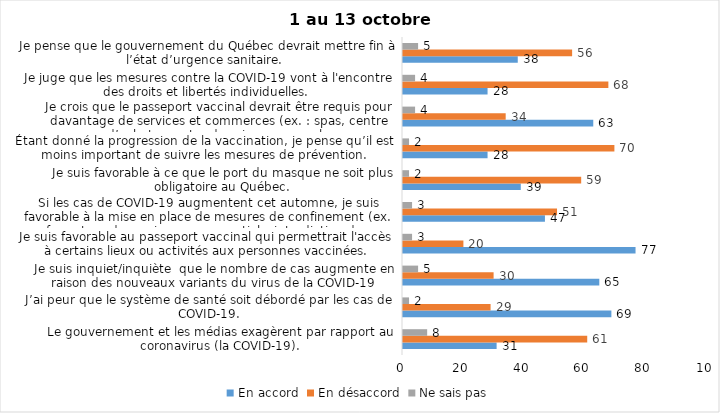
| Category | En accord | En désaccord | Ne sais pas |
|---|---|---|---|
| Le gouvernement et les médias exagèrent par rapport au coronavirus (la COVID-19). | 31 | 61 | 8 |
| J’ai peur que le système de santé soit débordé par les cas de COVID-19. | 69 | 29 | 2 |
| Je suis inquiet/inquiète  que le nombre de cas augmente en raison des nouveaux variants du virus de la COVID-19 | 65 | 30 | 5 |
| Je suis favorable au passeport vaccinal qui permettrait l'accès à certains lieux ou activités aux personnes vaccinées. | 77 | 20 | 3 |
| Si les cas de COVID-19 augmentent cet automne, je suis favorable à la mise en place de mesures de confinement (ex. fermeture de services non essentiels, interdiction des rassemblements privés) | 47 | 51 | 3 |
| Je suis favorable à ce que le port du masque ne soit plus obligatoire au Québec. | 39 | 59 | 2 |
| Étant donné la progression de la vaccination, je pense qu’il est moins important de suivre les mesures de prévention. | 28 | 70 | 2 |
| Je crois que le passeport vaccinal devrait être requis pour davantage de services et commerces (ex. : spas, centre d’achats, centre de soins personnels. | 63 | 34 | 4 |
| Je juge que les mesures contre la COVID-19 vont à l'encontre des droits et libertés individuelles.  | 28 | 68 | 4 |
| Je pense que le gouvernement du Québec devrait mettre fin à l’état d’urgence sanitaire.  | 38 | 56 | 5 |